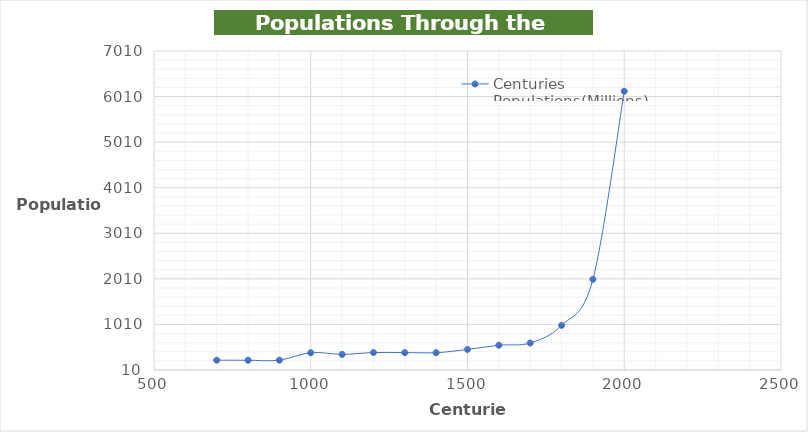
| Category | Centuries Populations(Millions) |
|---|---|
| 700.0 | 226 |
| 800.0 | 224 |
| 900.0 | 226 |
| 1000.0 | 390 |
| 1100.0 | 353 |
| 1200.0 | 393 |
| 1300.0 | 392 |
| 1400.0 | 390 |
| 1500.0 | 461 |
| 1600.0 | 554 |
| 1700.0 | 603 |
| 1800.0 | 989 |
| 1900.0 | 2000 |
| 2000.0 | 6127 |